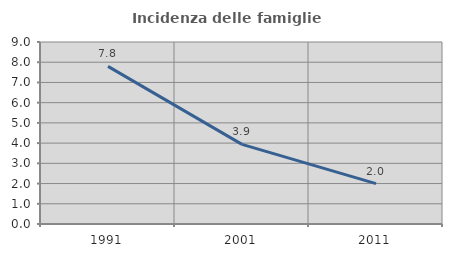
| Category | Incidenza delle famiglie numerose |
|---|---|
| 1991.0 | 7.797 |
| 2001.0 | 3.939 |
| 2011.0 | 1.994 |